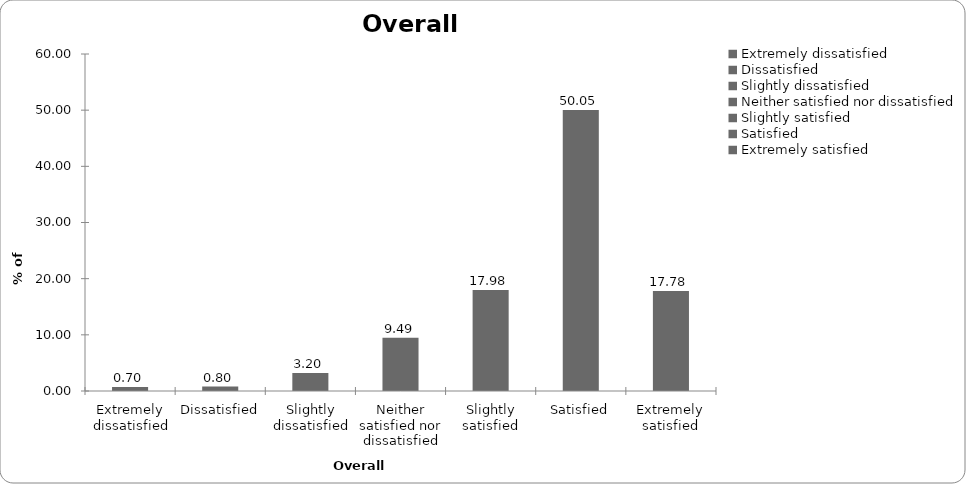
| Category | Overall satisfaction |
|---|---|
| Extremely dissatisfied | 0.699 |
| Dissatisfied | 0.799 |
| Slightly dissatisfied | 3.197 |
| Neither satisfied nor dissatisfied | 9.491 |
| Slightly satisfied | 17.982 |
| Satisfied | 50.05 |
| Extremely satisfied | 17.782 |